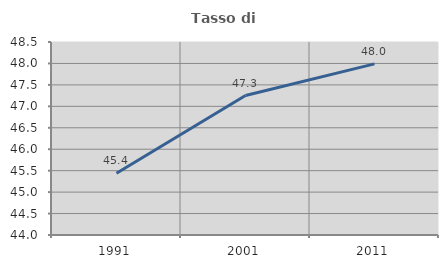
| Category | Tasso di occupazione   |
|---|---|
| 1991.0 | 45.439 |
| 2001.0 | 47.251 |
| 2011.0 | 47.99 |